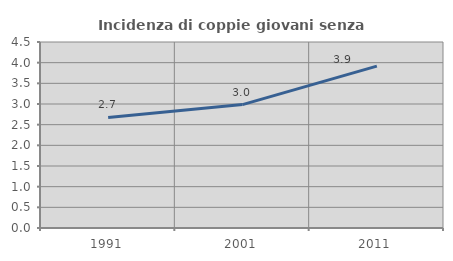
| Category | Incidenza di coppie giovani senza figli |
|---|---|
| 1991.0 | 2.674 |
| 2001.0 | 2.985 |
| 2011.0 | 3.917 |